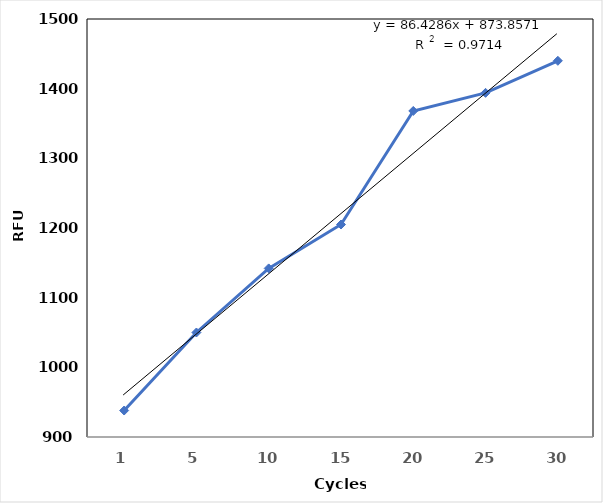
| Category | RFU |
|---|---|
| 1.0 | 938 |
| 5.0 | 1050 |
| 10.0 | 1142 |
| 15.0 | 1205 |
| 20.0 | 1368 |
| 25.0 | 1394 |
| 30.0 | 1440 |